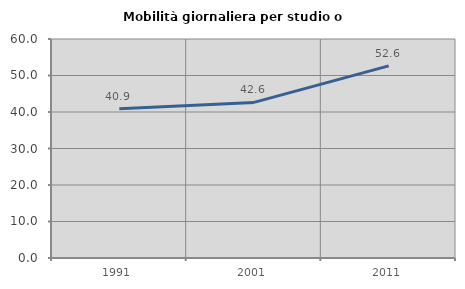
| Category | Mobilità giornaliera per studio o lavoro |
|---|---|
| 1991.0 | 40.883 |
| 2001.0 | 42.634 |
| 2011.0 | 52.632 |